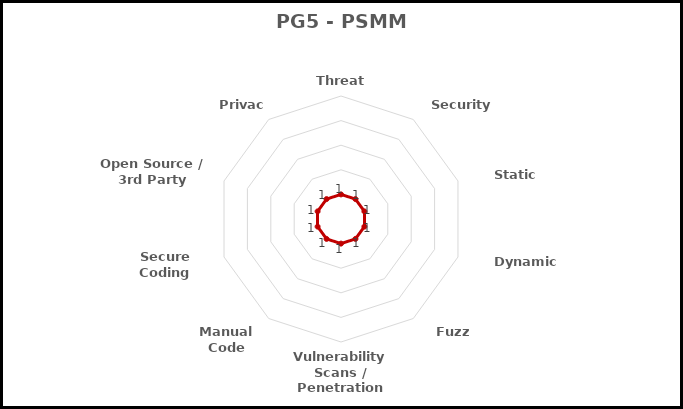
| Category | Technical Parameters |
|---|---|
| Threat Modeling | 1 |
| Security Testing | 1 |
| Static Analysis | 1 |
| Dynamic Analysis | 1 |
| Fuzz Testing | 1 |
| Vulnerability Scans / Penetration Testing | 1 |
| Manual Code Reviews | 1 |
| Secure Coding Standards | 1 |
| Open Source / 3rd Party Libraries | 1 |
| Privacy | 1 |